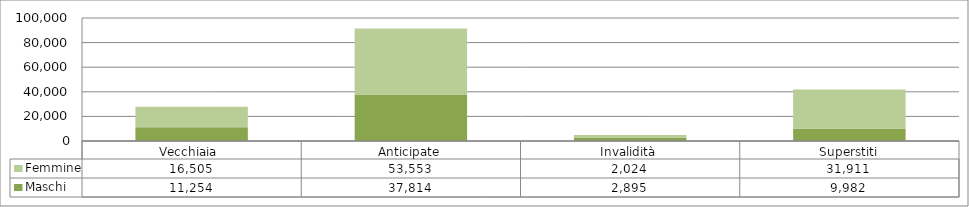
| Category | Maschi | Femmine |
|---|---|---|
| Vecchiaia  | 11254 | 16505 |
| Anticipate | 37814 | 53553 |
| Invalidità | 2895 | 2024 |
| Superstiti | 9982 | 31911 |